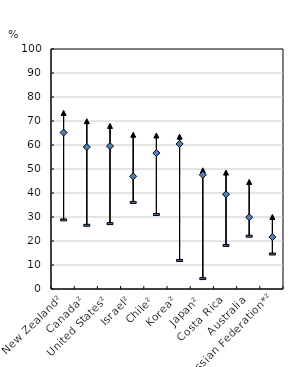
| Category | Participation in formal and/or non-formal education and training | Participation in formal education and training | Participation in non-formal education and training |
|---|---|---|---|
| New Zealand² | 73.375 | 28.806 | 65.168 |
| Canada² | 69.919 | 26.547 | 59.19 |
| United States² | 67.946 | 27.259 | 59.544 |
| Israel² | 64.273 | 36.079 | 46.896 |
| Chile² | 63.962 | 31.043 | 56.635 |
| Korea² | 63.462 | 11.876 | 60.46 |
| Japan² | 49.453 | 4.337 | 47.588 |
| Costa Rica | 48.51 | 18.159 | 39.453 |
| Australia | 44.6 | 22 | 29.9 |
| Russian Federation*² | 30.002 | 14.58 | 21.639 |